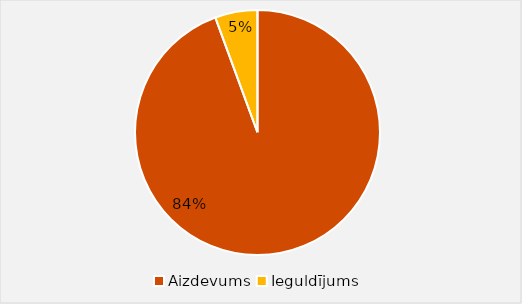
| Category | Series 0 |
|---|---|
| Aizdevums  | 0.843 |
| Ieguldījums  | 0.05 |